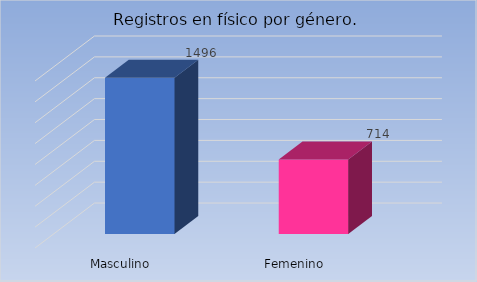
| Category | Cantidad |
|---|---|
| Masculino | 1496 |
| Femenino | 714 |